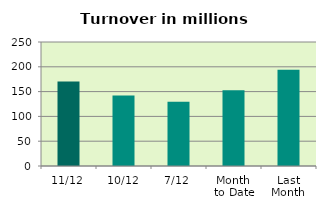
| Category | Series 0 |
|---|---|
| 11/12 | 170.442 |
| 10/12 | 142.14 |
| 7/12 | 129.763 |
| Month 
to Date | 152.786 |
| Last
Month | 193.997 |